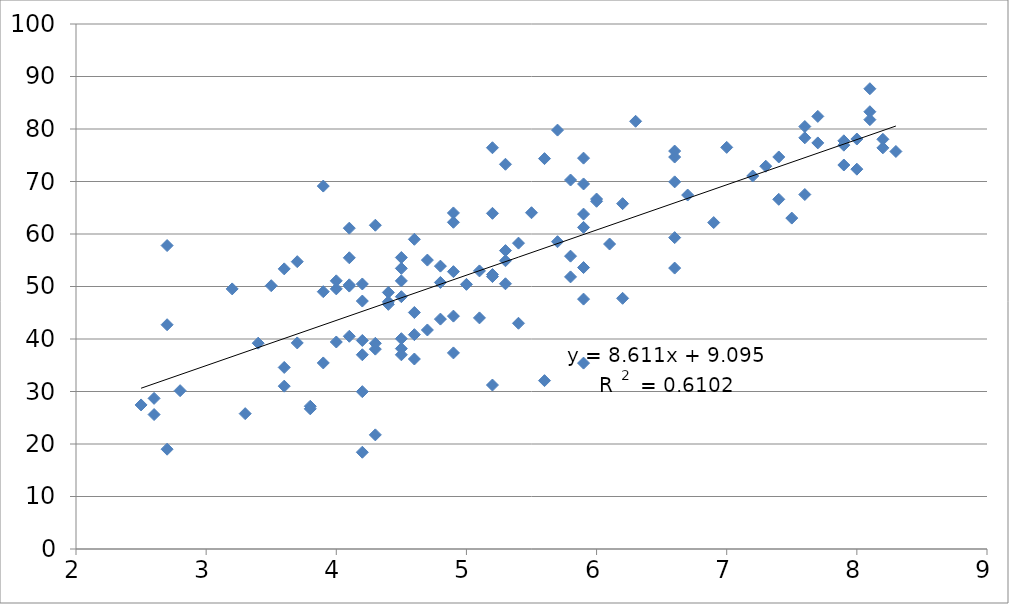
| Category | EPI Score |
|---|---|
| 3.7 | 54.73 |
| 4.1 | 50.08 |
| 2.6 | 28.69 |
| 4.0 | 49.55 |
| 4.3 | 61.67 |
| 7.7 | 82.4 |
| 7.6 | 78.32 |
| 4.1 | 55.47 |
| 5.8 | 51.83 |
| 2.6 | 25.61 |
| 7.4 | 66.61 |
| 4.2 | 50.48 |
| 5.9 | 47.6 |
| 5.1 | 52.97 |
| 4.9 | 64.01 |
| 4.1 | 40.52 |
| 3.3 | 25.78 |
| 3.9 | 35.44 |
| 7.9 | 73.14 |
| 3.6 | 31.02 |
| 6.6 | 69.93 |
| 5.4 | 43 |
| 4.8 | 50.77 |
| 5.7 | 58.53 |
| 4.2 | 39.72 |
| 4.9 | 62.23 |
| 6.0 | 66.23 |
| 6.3 | 81.47 |
| 7.9 | 76.92 |
| 4.4 | 47.08 |
| 4.1 | 61.11 |
| 4.8 | 43.79 |
| 6.6 | 74.66 |
| 4.0 | 39.43 |
| 8.3 | 75.72 |
| 7.2 | 71.05 |
| 4.4 | 46.6 |
| 4.2 | 47.23 |
| 7.6 | 80.47 |
| 5.6 | 32.07 |
| 5.3 | 73.28 |
| 4.5 | 48.06 |
| 4.3 | 38.07 |
| 2.7 | 19.01 |
| 4.4 | 48.87 |
| 5.8 | 70.28 |
| 7.0 | 76.5 |
| 5.2 | 31.23 |
| 4.9 | 44.36 |
| 4.0 | 51.08 |
| 7.4 | 74.67 |
| 6.2 | 65.78 |
| 5.6 | 74.36 |
| 5.4 | 58.26 |
| 8.0 | 72.35 |
| 5.8 | 55.78 |
| 4.5 | 51.07 |
| 4.5 | 36.99 |
| 5.9 | 63.79 |
| 5.2 | 63.94 |
| 5.5 | 64.05 |
| 3.5 | 50.15 |
| 2.7 | 42.72 |
| 5.9 | 61.26 |
| 8.1 | 83.29 |
| 5.0 | 50.41 |
| 3.8 | 26.7 |
| 4.5 | 40.06 |
| 6.6 | 59.31 |
| 4.2 | 18.43 |
| 6.7 | 67.42 |
| 3.8 | 27.19 |
| 6.1 | 58.09 |
| 4.7 | 55.03 |
| 3.6 | 53.36 |
| 4.5 | 55.52 |
| 5.2 | 51.89 |
| 4.2 | 29.97 |
| 2.5 | 27.44 |
| 4.2 | 37 |
| 7.9 | 77.75 |
| 8.2 | 76.41 |
| 4.1 | 50.32 |
| 3.4 | 39.2 |
| 8.2 | 78.04 |
| 6.2 | 47.75 |
| 3.6 | 34.58 |
| 5.3 | 56.84 |
| 3.7 | 39.25 |
| 4.6 | 45.05 |
| 5.1 | 44.02 |
| 5.9 | 69.53 |
| 6.6 | 75.8 |
| 7.5 | 63.03 |
| 5.3 | 50.52 |
| 4.5 | 53.45 |
| 5.9 | 35.41 |
| 6.0 | 66.66 |
| 4.6 | 40.83 |
| 3.9 | 69.13 |
| 4.3 | 21.74 |
| 8.1 | 81.78 |
| 5.9 | 74.45 |
| 5.2 | 76.43 |
| 6.6 | 53.51 |
| 5.7 | 79.79 |
| 4.8 | 53.88 |
| 4.9 | 37.35 |
| 8.0 | 78.09 |
| 8.1 | 87.67 |
| 6.9 | 62.18 |
| 4.6 | 36.19 |
| 4.9 | 52.83 |
| 5.2 | 52.28 |
| 4.6 | 58.99 |
| 5.3 | 54.91 |
| 4.3 | 39.18 |
| 3.9 | 49.01 |
| 7.3 | 72.91 |
| 7.7 | 77.35 |
| 7.6 | 67.52 |
| 5.9 | 53.61 |
| 2.7 | 57.8 |
| 4.5 | 38.17 |
| 2.8 | 30.16 |
| 4.7 | 41.72 |
| 3.2 | 49.54 |